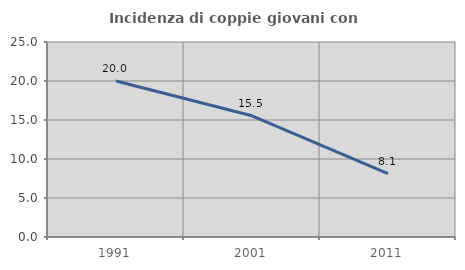
| Category | Incidenza di coppie giovani con figli |
|---|---|
| 1991.0 | 20 |
| 2001.0 | 15.544 |
| 2011.0 | 8.14 |